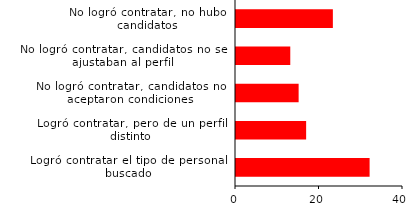
| Category | Series 0 |
|---|---|
| Logró contratar el tipo de personal buscado | 32 |
| Logró contratar, pero de un perfil distinto | 16.8 |
| No logró contratar, candidatos no aceptaron condiciones | 15 |
| No logró contratar, candidatos no se ajustaban al perfil | 13 |
| No logró contratar, no hubo candidatos | 23.2 |